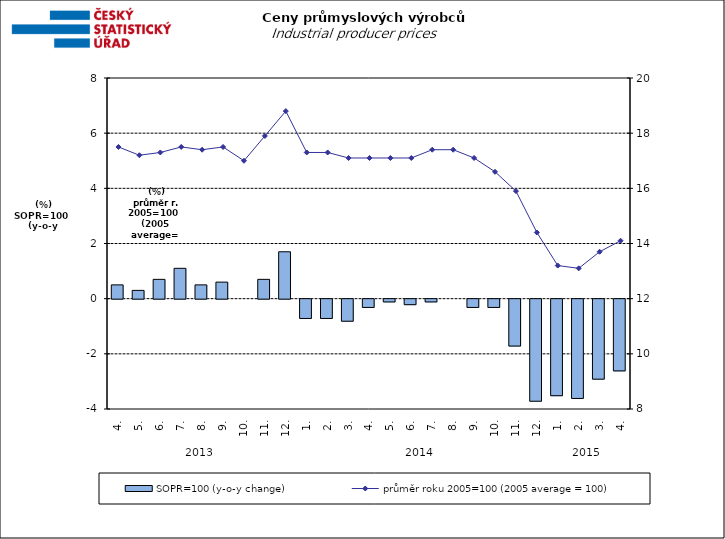
| Category | SOPR=100 (y-o-y change)   |
|---|---|
| 0 | 0.5 |
| 1 | 0.3 |
| 2 | 0.7 |
| 3 | 1.1 |
| 4 | 0.5 |
| 5 | 0.6 |
| 6 | 0 |
| 7 | 0.7 |
| 8 | 1.7 |
| 9 | -0.7 |
| 10 | -0.7 |
| 11 | -0.8 |
| 12 | -0.3 |
| 13 | -0.1 |
| 14 | -0.2 |
| 15 | -0.1 |
| 16 | 0 |
| 17 | -0.3 |
| 18 | -0.3 |
| 19 | -1.7 |
| 20 | -3.7 |
| 21 | -3.5 |
| 22 | -3.6 |
| 23 | -2.9 |
| 24 | -2.6 |